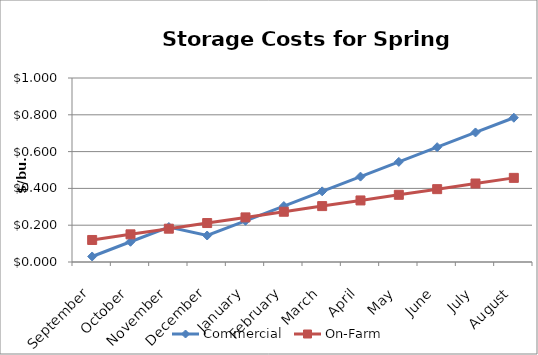
| Category | Commercial | On-Farm |
|---|---|---|
| September | 0.03 | 0.12 |
| October | 0.11 | 0.15 |
| November | 0.19 | 0.181 |
| December | 0.144 | 0.212 |
| January | 0.224 | 0.242 |
| February | 0.304 | 0.273 |
| March | 0.384 | 0.304 |
| April | 0.464 | 0.335 |
| May | 0.544 | 0.365 |
| June | 0.624 | 0.396 |
| July | 0.704 | 0.427 |
| August | 0.784 | 0.457 |